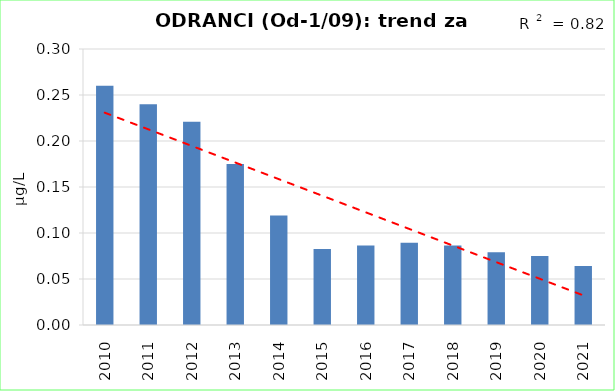
| Category | Vsota |
|---|---|
| 2010 | 0.26 |
| 2011 | 0.24 |
| 2012 | 0.221 |
| 2013 | 0.175 |
| 2014 | 0.119 |
| 2015 | 0.082 |
| 2016 | 0.086 |
| 2017 | 0.09 |
| 2018 | 0.086 |
| 2019 | 0.079 |
| 2020 | 0.075 |
| 2021 | 0.064 |